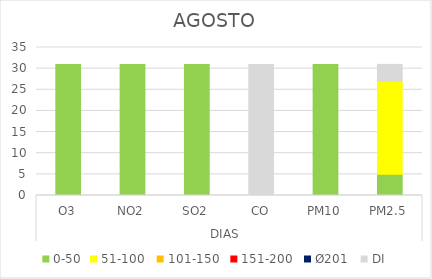
| Category | 0-50 | 51-100  | 101-150  | 151-200  | Ø201  | DI |
|---|---|---|---|---|---|---|
| 0 | 31 | 0 | 0 | 0 | 0 | 0 |
| 1 | 31 | 0 | 0 | 0 | 0 | 0 |
| 2 | 31 | 0 | 0 | 0 | 0 | 0 |
| 3 | 0 | 0 | 0 | 0 | 0 | 31 |
| 4 | 31 | 0 | 0 | 0 | 0 | 0 |
| 5 | 5 | 22 | 0 | 0 | 0 | 4 |